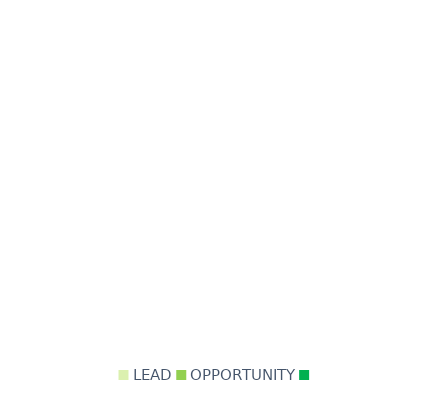
| Category | Series 0 |
|---|---|
| LEAD | 0 |
| OPPORTUNITY | 0 |